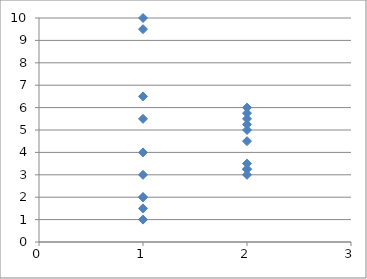
| Category | Series 0 |
|---|---|
| 1.0 | 1.5 |
| 1.0 | 3 |
| 1.0 | 1 |
| 1.0 | 2 |
| 1.0 | 2 |
| 1.0 | 4 |
| 1.0 | 5.5 |
| 1.0 | 6.5 |
| 1.0 | 9.5 |
| 1.0 | 10 |
| 2.0 | 3 |
| 2.0 | 3.25 |
| 2.0 | 3.25 |
| 2.0 | 3.5 |
| 2.0 | 4.5 |
| 2.0 | 5 |
| 2.0 | 5.25 |
| 2.0 | 5.5 |
| 2.0 | 5.75 |
| 2.0 | 6 |